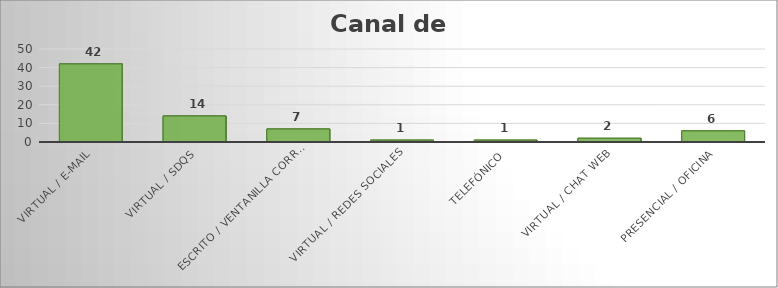
| Category | Series 0 |
|---|---|
| VIRTUAL / E-MAIL | 42 |
| VIRTUAL / SDQS | 14 |
| ESCRITO / VENTANILLA CORRESPONDENCIA | 7 |
| VIRTUAL / REDES SOCIALES | 1 |
| TELEFÓNICO | 1 |
| VIRTUAL / CHAT WEB | 2 |
| PRESENCIAL / OFICINA | 6 |